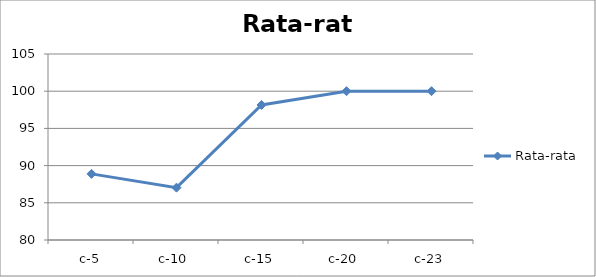
| Category | Rata-rata |
|---|---|
| c-5 | 88.889 |
| c-10 | 87.037 |
| c-15 | 98.148 |
| c-20 | 100 |
| c-23 | 100 |